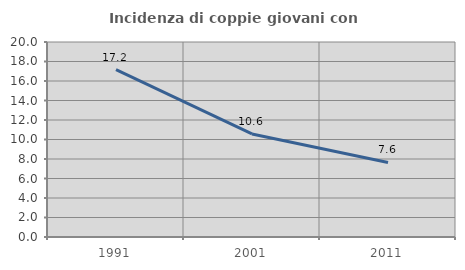
| Category | Incidenza di coppie giovani con figli |
|---|---|
| 1991.0 | 17.167 |
| 2001.0 | 10.573 |
| 2011.0 | 7.643 |